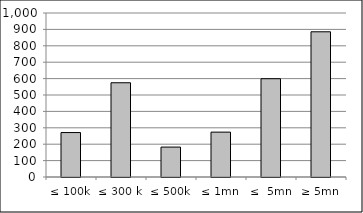
| Category | Series 0 |
|---|---|
| ≤ 100k | 270963541.465 |
| ≤ 300 k | 574668727.043 |
| ≤ 500k | 182435336.509 |
| ≤ 1mn | 273594198.834 |
| ≤  5mn | 599340396.79 |
| ≥ 5mn | 885385525.83 |